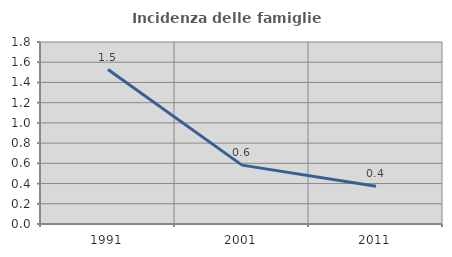
| Category | Incidenza delle famiglie numerose |
|---|---|
| 1991.0 | 1.528 |
| 2001.0 | 0.582 |
| 2011.0 | 0.374 |